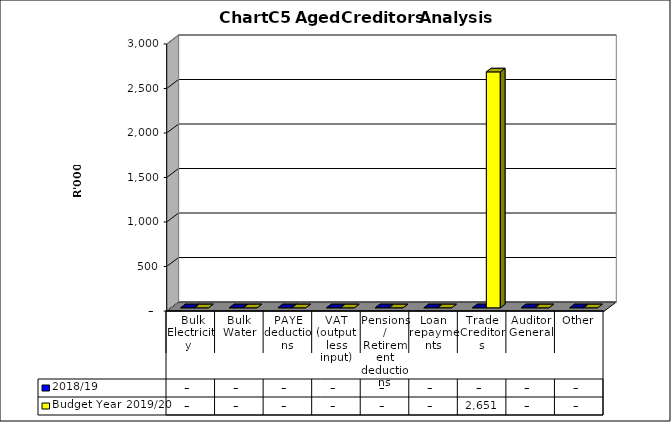
| Category | 2018/19 | Budget Year 2019/20 |
|---|---|---|
|  Bulk Electricity  | 0 | 0 |
| Bulk Water | 0 | 0 |
| PAYE deductions | 0 | 0 |
| VAT (output less input) | 0 | 0 |
| Pensions / Retirement deductions | 0 | 0 |
| Loan repayments | 0 | 0 |
| Trade Creditors | 0 | 2650630.51 |
| Auditor General | 0 | 0 |
| Other | 0 | 0 |